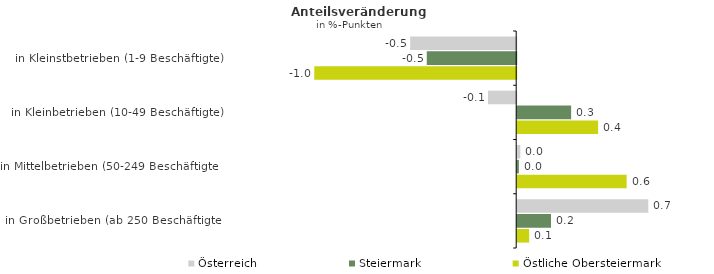
| Category | Österreich | Steiermark | Östliche Obersteiermark |
|---|---|---|---|
| in Kleinstbetrieben (1-9 Beschäftigte) | -0.55 | -0.464 | -1.047 |
| in Kleinbetrieben (10-49 Beschäftigte) | -0.146 | 0.28 | 0.42 |
| in Mittelbetrieben (50-249 Beschäftigte) | 0.016 | 0.009 | 0.568 |
| in Großbetrieben (ab 250 Beschäftigte) | 0.68 | 0.175 | 0.062 |